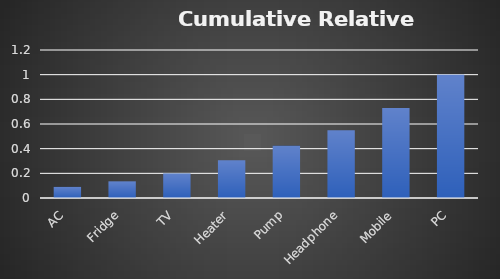
| Category | Cumulative Relative Frequency |
|---|---|
| AC | 0.09 |
| Fridge | 0.135 |
| TV | 0.198 |
| Heater | 0.306 |
| Pump | 0.423 |
| Headphone | 0.55 |
| Mobile | 0.73 |
| PC | 1 |